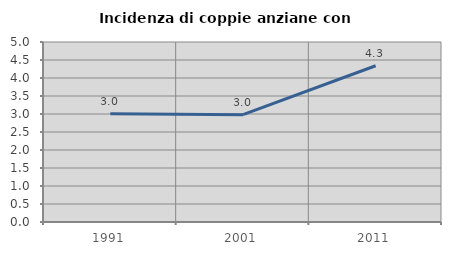
| Category | Incidenza di coppie anziane con figli |
|---|---|
| 1991.0 | 3.005 |
| 2001.0 | 2.98 |
| 2011.0 | 4.341 |